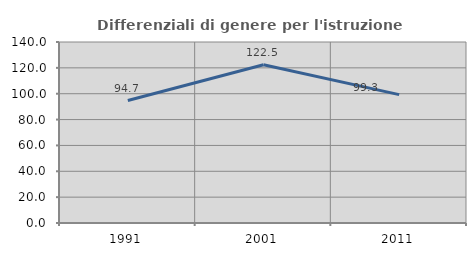
| Category | Differenziali di genere per l'istruzione superiore |
|---|---|
| 1991.0 | 94.713 |
| 2001.0 | 122.453 |
| 2011.0 | 99.319 |